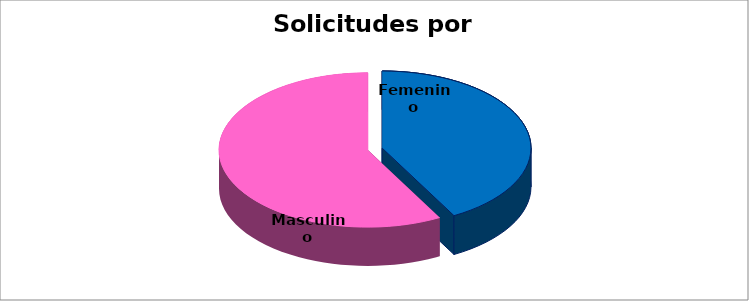
| Category | Series 0 |
|---|---|
| Femenino | 144 |
| Masculino | 199 |